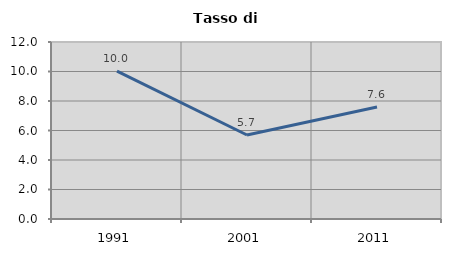
| Category | Tasso di disoccupazione   |
|---|---|
| 1991.0 | 10.022 |
| 2001.0 | 5.697 |
| 2011.0 | 7.597 |